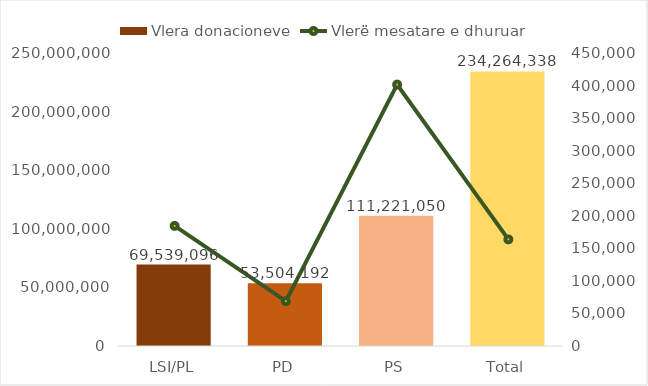
| Category | Vlera donacioneve |
|---|---|
| LSI/PL | 69539095.955 |
| PD | 53504191.94 |
| PS | 111221050 |
| Total | 234264337.895 |